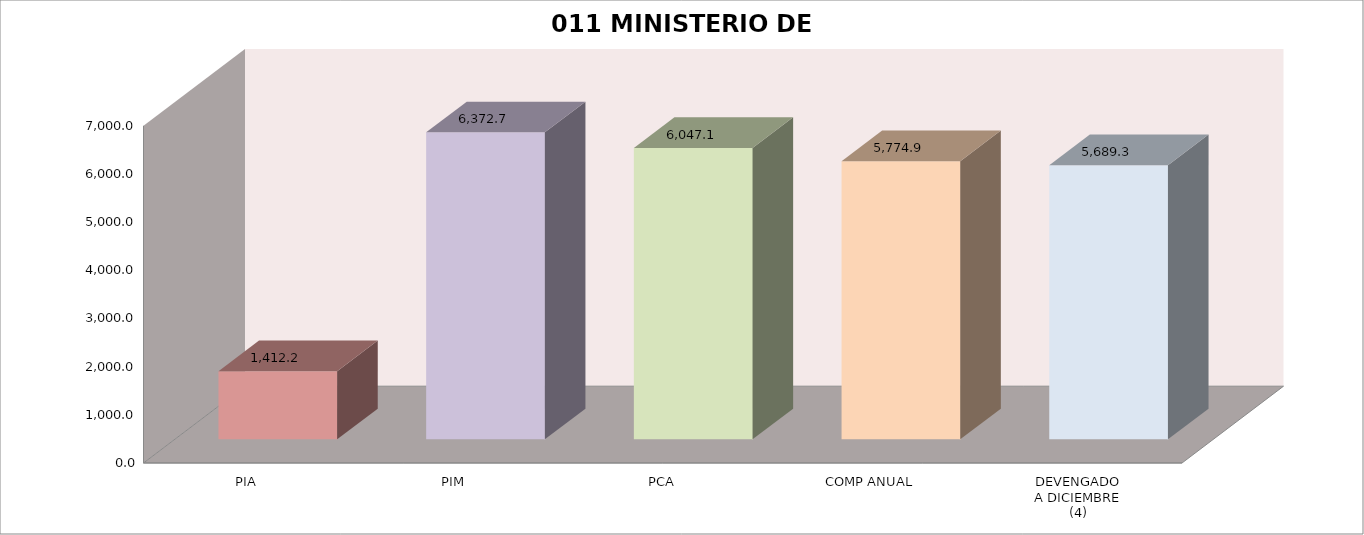
| Category | 011 MINISTERIO DE SALUD |
|---|---|
| PIA | 1412.218 |
| PIM | 6372.669 |
| PCA | 6047.104 |
| COMP ANUAL | 5774.864 |
| DEVENGADO
A DICIEMBRE
(4) | 5689.342 |